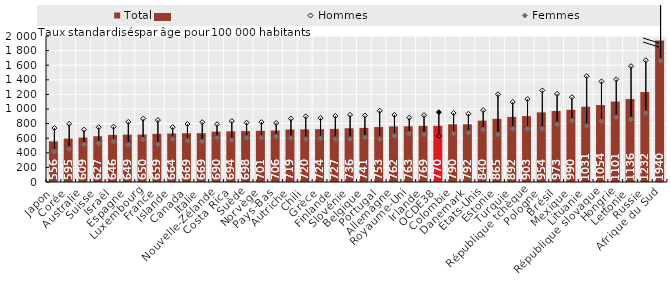
| Category | Total |
|---|---|
| Japon | 556.3 |
| Corée | 595.1 |
| Australie | 609 |
| Suisse | 626.7 |
| Israël | 645.8 |
| Espagne | 648.5 |
| Luxembourg | 649.7 |
| France | 659.4 |
| Islande | 664.2 |
| Canada | 668.6 |
| Italie | 669.3 |
| Nouvelle-Zélande | 689.9 |
| Costa Rica | 693.8 |
| Suède | 698.2 |
| Norvège | 701.2 |
| Pays-Bas | 705.8 |
| Autriche | 719.1 |
| Chili | 720.4 |
| Grèce | 724.4 |
| Finlande | 727.3 |
| Slovénie | 736 |
| Belgique | 740.7 |
| Portugal | 752.9 |
| Allemagne | 761.5 |
| Royaume-Uni | 762.6 |
| Irlande | 769.1 |
| OCDE38 | 769.571 |
| Colombie | 790.1 |
| Danemark | 791.5 |
| États-Unis | 840.2 |
| Estonie | 865.1 |
| Turquie | 892.3 |
| République tchèque | 902.6 |
| Pologne | 953.9 |
| Brésil | 972.6 |
| Mexique | 989.7 |
| Lituanie | 1031.4 |
| République slovaque | 1054.2 |
| Hongrie | 1100.8 |
| Lettonie | 1136.4 |
| Russie | 1231.8 |
| Afrique du Sud | 1939.7 |